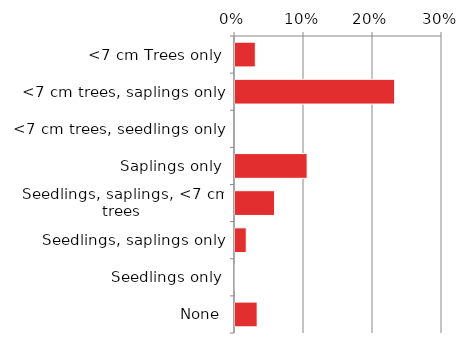
| Category | Native |
|---|---|
| None | 0.034 |
| Seedlings only | 0.001 |
| Seedlings, saplings only | 0.018 |
| Seedlings, saplings, <7 cm trees | 0.059 |
| Saplings only | 0.106 |
| <7 cm trees, seedlings only | 0 |
| <7 cm trees, saplings only | 0.233 |
| <7 cm Trees only | 0.031 |